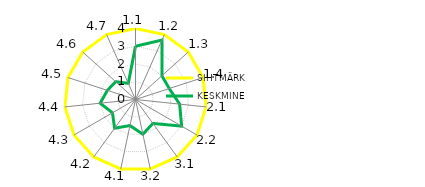
| Category | SIHTMÄRK | KESKMINE |
|---|---|---|
| 1.1 | 4 | 3 |
| 1.2 | 4 | 3.667 |
| 1.3 | 4 | 2 |
| 1.4 | 4 | 2 |
| 2.1 | 4 | 2.5 |
| 2.2 | 4 | 3 |
| 3.1 | 4 | 1.667 |
| 3.2 | 4 | 2 |
| 4.1 | 4 | 1.5 |
| 4.2 | 4 | 2 |
| 4.3 | 4 | 1.5 |
| 4.4 | 4 | 2 |
| 4.5 | 4 | 1.667 |
| 4.6 | 4 | 1.5 |
| 4.7 | 4 | 1 |